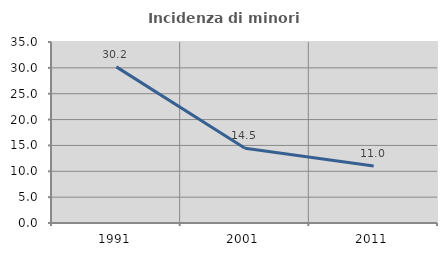
| Category | Incidenza di minori stranieri |
|---|---|
| 1991.0 | 30.189 |
| 2001.0 | 14.458 |
| 2011.0 | 11.017 |